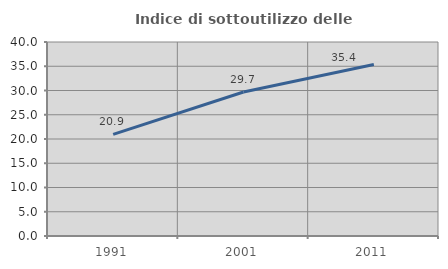
| Category | Indice di sottoutilizzo delle abitazioni  |
|---|---|
| 1991.0 | 20.942 |
| 2001.0 | 29.699 |
| 2011.0 | 35.363 |